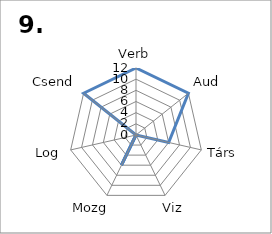
| Category | Series 0 |
|---|---|
| Verb | 12 |
| Aud | 12 |
| Társ | 6 |
| Viz | 0 |
| Mozg | 6 |
| Log | 0 |
| Csend | 12 |